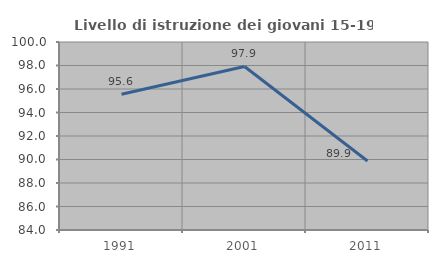
| Category | Livello di istruzione dei giovani 15-19 anni |
|---|---|
| 1991.0 | 95.556 |
| 2001.0 | 97.917 |
| 2011.0 | 89.873 |